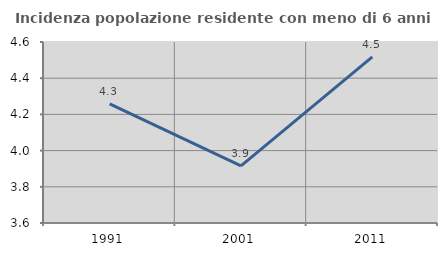
| Category | Incidenza popolazione residente con meno di 6 anni |
|---|---|
| 1991.0 | 4.258 |
| 2001.0 | 3.915 |
| 2011.0 | 4.518 |